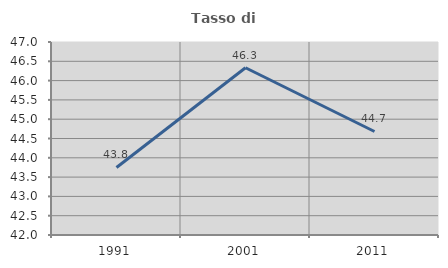
| Category | Tasso di occupazione   |
|---|---|
| 1991.0 | 43.75 |
| 2001.0 | 46.333 |
| 2011.0 | 44.682 |